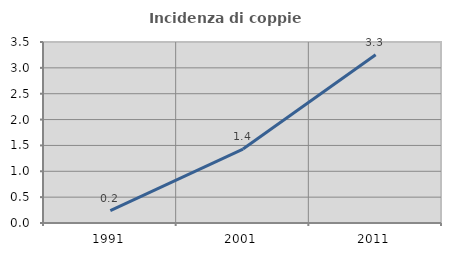
| Category | Incidenza di coppie miste |
|---|---|
| 1991.0 | 0.241 |
| 2001.0 | 1.43 |
| 2011.0 | 3.252 |